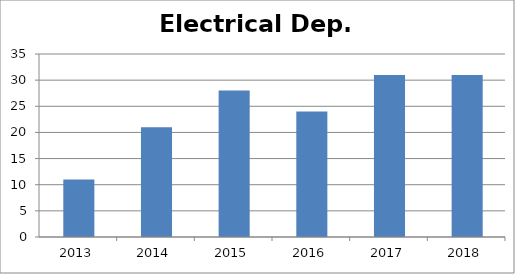
| Category | Electrical Dep. Publications |
|---|---|
| 0 | 11 |
| 1 | 21 |
| 2 | 28 |
| 3 | 24 |
| 4 | 31 |
| 5 | 31 |